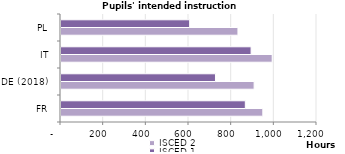
| Category | ISCED 2 | ISCED 1 |
|---|---|---|
| FR | 946 | 864 |
| DE (2018) | 905.245 | 724.1 |
| IT | 990 | 891 |
| PL | 829.4 | 603.1 |